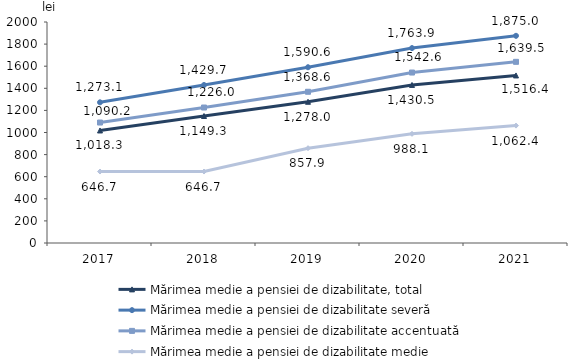
| Category | Mărimea medie a pensiei de dizabilitate, total | Mărimea medie a pensiei de dizabilitate severă | Mărimea medie a pensiei de dizabilitate accentuată | Mărimea medie a pensiei de dizabilitate medie |
|---|---|---|---|---|
| 2017.0 | 1018.3 | 1273.1 | 1090.19 | 646.68 |
| 2018.0 | 1149.3 | 1429.7 | 1226 | 646.7 |
| 2019.0 | 1278 | 1590.6 | 1368.6 | 857.9 |
| 2020.0 | 1430.5 | 1763.9 | 1542.6 | 988.1 |
| 2021.0 | 1516.4 | 1875 | 1639.5 | 1062.4 |